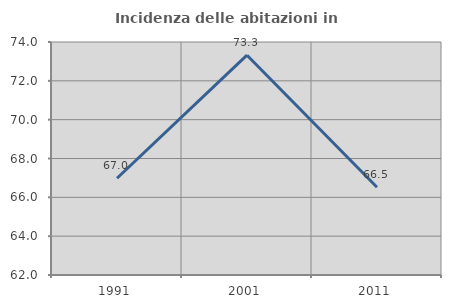
| Category | Incidenza delle abitazioni in proprietà  |
|---|---|
| 1991.0 | 66.981 |
| 2001.0 | 73.32 |
| 2011.0 | 66.52 |